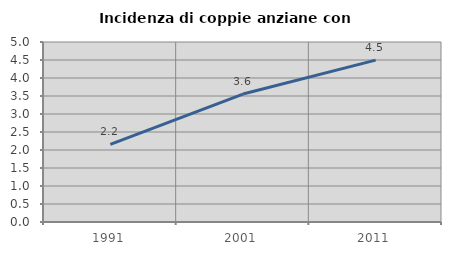
| Category | Incidenza di coppie anziane con figli |
|---|---|
| 1991.0 | 2.158 |
| 2001.0 | 3.554 |
| 2011.0 | 4.497 |